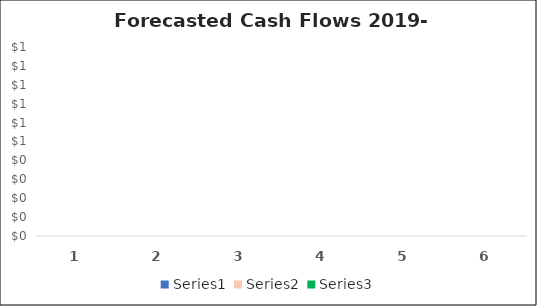
| Category | Series 1 | Series 2 | Series 3 |
|---|---|---|---|
| 0 | 0 | 0 | 107000 |
| 1 | -21522.082 | -15000 | 0 |
| 2 | -18616.208 | -10000 | 0 |
| 3 | -17578.775 | -25000 | 0 |
| 4 | -15092.587 | -10000 | 0 |
| 5 | -14880.39 | -15000 | 0 |